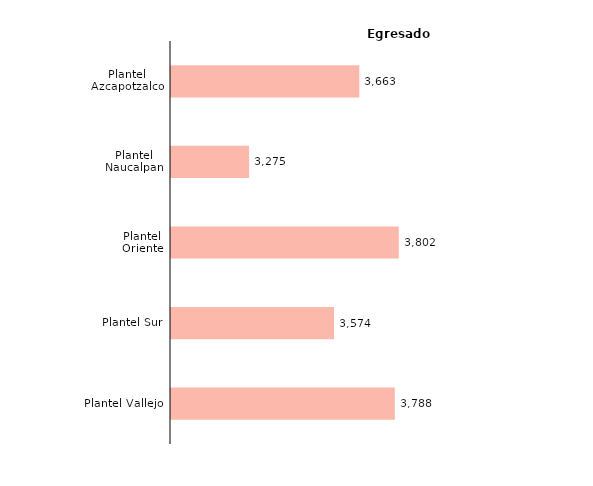
| Category | Series 0 |
|---|---|
| Plantel Vallejo | 3788 |
| Plantel Sur | 3574 |
| Plantel Oriente | 3802 |
| Plantel Naucalpan | 3275 |
| Plantel Azcapotzalco | 3663 |